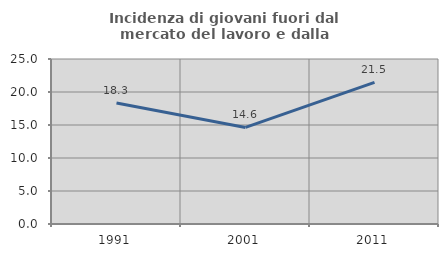
| Category | Incidenza di giovani fuori dal mercato del lavoro e dalla formazione  |
|---|---|
| 1991.0 | 18.333 |
| 2001.0 | 14.634 |
| 2011.0 | 21.451 |